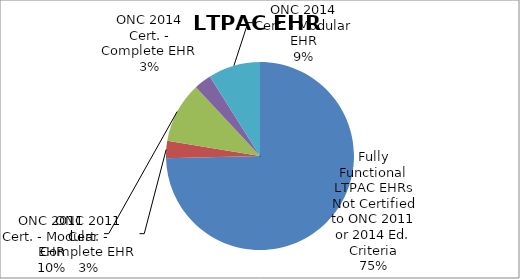
| Category | Series 0 |
|---|---|
| Fully Functional LTPAC EHRs Not Certified to ONC 2011 or 2014 Ed. Criteria | 50 |
| ONC 2011 Cert. - Complete EHR | 2 |
| ONC 2011 Cert. - Modular EHR | 7 |
| ONC 2014 Cert. - Complete EHR | 2 |
| ONC 2014 Cert. - Modular EHR | 6 |